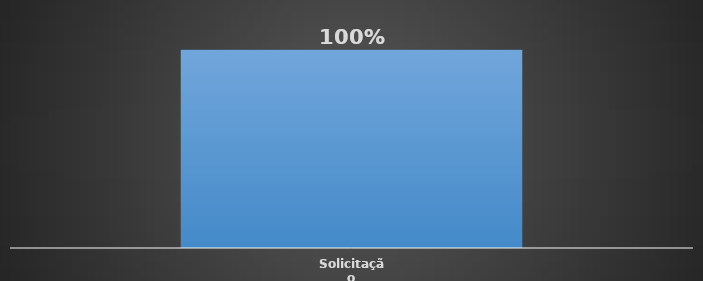
| Category | Total |
|---|---|
| Solicitação | 1 |